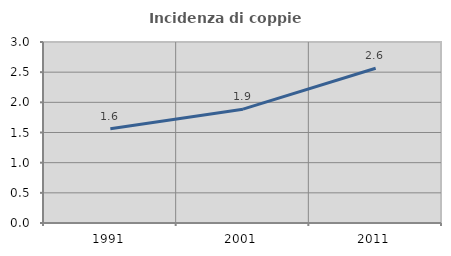
| Category | Incidenza di coppie miste |
|---|---|
| 1991.0 | 1.562 |
| 2001.0 | 1.887 |
| 2011.0 | 2.564 |